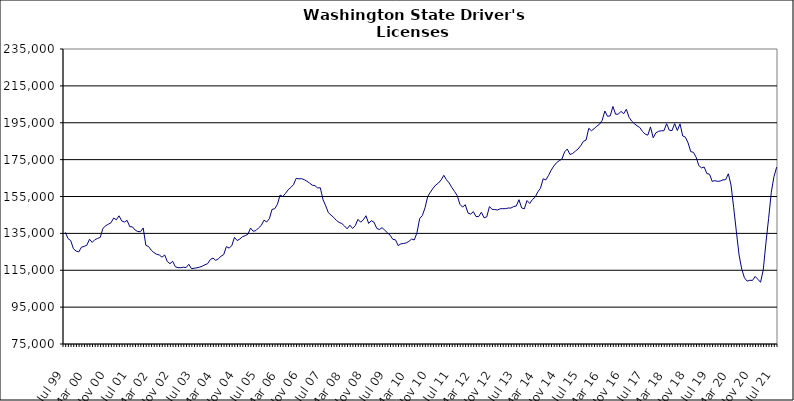
| Category | Series 0 |
|---|---|
| Jul 99 | 135560 |
| Aug 99 | 132182 |
| Sep 99 | 131104 |
| Oct 99 | 126694 |
| Nov 99 | 125425 |
| Dec 99 | 124927 |
| Jan 00 | 127499 |
| Feb 00 | 127927 |
| Mar 00 | 128547 |
| Apr 00 | 131834 |
| May 00 | 130120 |
| Jun 00 | 131595 |
| Jul 00 | 132236 |
| Aug 00 | 132819 |
| Sep 00 | 137711 |
| Oct 00 | 139063 |
| Nov 00 | 139952 |
| Dec 00 | 140732 |
| Jan 01 | 143338 |
| Feb 01 | 142359 |
| Mar 01 | 144523 |
| Apr 01 | 141758 |
| May 01 | 141135 |
| Jun 01 | 142064 |
| Jul 01 | 138646 |
| Aug 01 | 138530 |
| Sep 01 | 136784 |
| Oct 01 | 135996 |
| Nov 01 | 135917 |
| Dec 01 | 137940 |
| Jan 02 | 128531 |
| Feb 02 | 127848 |
| Mar 02 | 125876 |
| Apr 02 | 124595 |
| May 02 | 123660 |
| Jun 02 | 123282 |
| Jul 02 | 122089 |
| Aug 02 | 123279 |
| Sep 02 | 119727 |
| Oct 02 | 118588 |
| Nov 02 | 119854 |
| Dec 02 | 116851 |
| Jan 03 | 116407 |
| Feb 03 | 116382 |
| Mar 03 | 116648 |
| Apr 03 | 116471 |
| May 03 | 118231 |
| Jun 03 | 115831 |
| Jul 03 | 116082 |
| Aug 03 | 116341 |
| Sep 03 | 116653 |
| Oct 03 | 117212 |
| Nov 03 | 117962 |
| Dec 03 | 118542 |
| Jan 04 | 120817 |
| Feb 04 | 121617 |
| Mar 04 | 120369 |
| Apr 04 | 121200 |
| May 04 | 122609 |
| Jun 04 | 123484 |
| Jul 04 | 127844 |
| Aug 04 | 127025 |
| Sep 04 | 128273 |
| Oct 04 | 132853 |
| Nov 04 | 131106 |
| Dec 04 | 131935 |
| Jan 05 | 133205 |
| Feb 05 | 133736 |
| Mar 05 | 134528 |
| Apr 05 | 137889 |
| May 05 | 136130 |
| Jun 05 | 136523 |
| Jul 05 | 137997 |
| Aug 05 | 139294 |
| Sep 05 | 142140 |
| Oct 05 | 141192 |
| Nov 05 | 142937 |
| Dec 05 | 148013 |
| Jan 06 | 148341 |
| Feb 06 | 150744 |
| Mar 06 | 155794 |
| Apr 06 | 154984 |
| May 06 | 156651 |
| Jun 06 | 158638 |
| Jul 06 | 159911 |
| Aug 06 | 161445 |
| Sep 06 | 164852 |
| Oct 06 | 164570 |
| Nov 06 | 164679 |
| Dec 06 | 164127 |
| Jan 07 | 163271 |
| Feb 07 | 162273 |
| Mar 07 | 161140 |
| Apr 07 | 160860 |
| May 07 | 159633 |
| Jun 07 | 159724 |
| Jul 07 | 153303 |
| Aug 07 | 149939 |
| Sep 07 | 146172 |
| Oct 07 | 144876 |
| Nov 07 | 143613 |
| Dec 07 | 142022 |
| Jan 08 | 140909 |
| Feb 08 | 140368 |
| Mar 08 | 138998 |
| Apr 08 | 137471 |
| May 08 | 139453 |
| Jun 08 | 137680 |
| Jul 08 | 139120 |
| Aug 08 | 142612 |
| Sep-08 | 141071 |
| Oct 08 | 142313 |
| Nov 08 | 144556 |
| Dec 08 | 140394 |
| Jan 09 | 141903 |
| Feb 09 | 141036 |
| Mar 09 | 137751 |
| Apr 09 | 137060 |
| May 09 | 138101 |
| Jun 09 | 136739 |
| Jul 09 | 135317 |
| Aug 09 | 134020 |
| Sep 09 | 131756 |
| Oct 09 | 131488 |
| Nov 09 | 128370 |
| Dec 09 | 129323 |
| Jan 10 | 129531 |
| Feb 10 | 129848 |
| Mar 10 | 130654 |
| Apr 10 | 131929 |
| May 10 | 131429 |
| Jun 10 | 135357 |
| Jul 10 | 143032 |
| Aug 10 | 144686 |
| Sep 10 | 148856 |
| Oct 10 | 155042 |
| Nov 10 | 157328 |
| Dec 10 | 159501 |
| Jan 11 | 161221 |
| Feb 11 | 162312 |
| Mar 11 | 163996 |
| Apr 11 | 166495 |
| May 11 | 164040 |
| Jun 11 | 162324 |
| Jul 11 | 159862 |
| Aug 11 | 157738 |
| Sep 11 | 155430 |
| Oct 11 | 150762 |
| Nov 11 | 149255 |
| Dec 11 | 150533 |
| Jan 12 | 146068 |
| Feb 12 | 145446 |
| Mar 12 | 146788 |
| Apr 12 | 144110 |
| May 12 | 144162 |
| Jun 12 | 146482 |
| Jul 12 | 143445 |
| Aug 12 | 143950 |
| Sep 12 | 149520 |
| Oct 12 | 148033 |
| Nov 12 | 147926 |
| Dec 12 | 147674 |
| Jan 13 | 148360 |
| Feb-13 | 148388 |
| Mar-13 | 148414 |
| Apr 13 | 148749 |
| May 13 | 148735 |
| Jun-13 | 149521 |
| Jul 13 | 149837 |
| Aug 13 | 153252 |
| Sep 13 | 148803 |
| Oct 13 | 148315 |
| Nov 13 | 152804 |
| Dec 13 | 151209 |
| Jan 14 | 153357 |
| Feb-14 | 154608 |
| Mar 14 | 157479 |
| Apr 14 | 159441 |
| May 14 | 164591 |
| Jun 14 | 163995 |
| Jul-14 | 166411 |
| Aug-14 | 169272 |
| Sep 14 | 171565 |
| Oct 14 | 173335 |
| Nov 14 | 174406 |
| Dec 14 | 175302 |
| Jan 15 | 179204 |
| Feb 15 | 180737 |
| Mar 15 | 177810 |
| Apr-15 | 178331 |
| May 15 | 179601 |
| Jun-15 | 180729 |
| Jul 15 | 182540 |
| Aug 15 | 184924 |
| Sep 15 | 185620 |
| Oct 15 | 192002 |
| Nov 15 | 190681 |
| Dec 15 | 191795 |
| Jan 16 | 193132 |
| Feb 16 | 194206 |
| Mar 16 | 196319 |
| Apr 16 | 201373 |
| May 16 | 198500 |
| Jun 16 | 198743 |
| Jul 16 | 203841 |
| Aug 16 | 199630 |
| Sep 16 | 199655 |
| Oct 16 | 201181 |
| Nov 16 | 199888 |
| Dec 16 | 202304 |
| Jan 17 | 197977 |
| Feb 17 | 195889 |
| Mar 17 | 194438 |
| Apr 17 | 193335 |
| May 17 | 192430 |
| Jun 17 | 190298 |
| Jul 17 | 188832 |
| Aug 17 | 188264 |
| Sep 17 | 192738 |
| Oct 17 | 186856 |
| Nov 17 | 189537 |
| Dec 17 | 190341 |
| Jan 18 | 190670 |
| Feb 18 | 190645 |
| Mar 18 | 194476 |
| Apr 18 | 190971 |
| May 18 | 190707 |
| Jun 18 | 194516 |
| Jul 18 | 190783 |
| Aug 18 | 194390 |
| Sep 18 | 187831 |
| Oct 18 | 187188 |
| Nov 18 | 184054 |
| Dec 18 | 179347 |
| Jan 19 | 178958 |
| Feb 19 | 176289 |
| Mar 19 | 171747 |
| Apr 19 | 170532 |
| May 19 | 170967 |
| Jun 19 | 167444 |
| Jul 19 | 167059 |
| Aug 19 | 163194 |
| Sep 19 | 163599 |
| Oct 19 | 163212 |
| Nov 19 | 163388 |
| Dec 19 | 164024 |
| Jan 20 | 164114 |
| Feb 20 | 167320 |
| Mar 20 | 161221 |
| Apr 20 | 148866 |
| May 20 | 135821 |
| Jun 20 | 123252 |
| Jul 20 | 115526 |
| Aug 20 | 110940 |
| Sep 20 | 109099 |
| Oct 20 | 109566 |
| Nov 20 | 109488 |
| Dec 20 | 111658 |
| Jan 21 | 110070 |
| Feb 21 | 108491 |
| Mar 21 | 115176 |
| Apr 21 | 129726 |
| May 21 | 143052 |
| Jun 21 | 157253 |
| Jul 21 | 165832 |
| Aug 21 | 170937 |